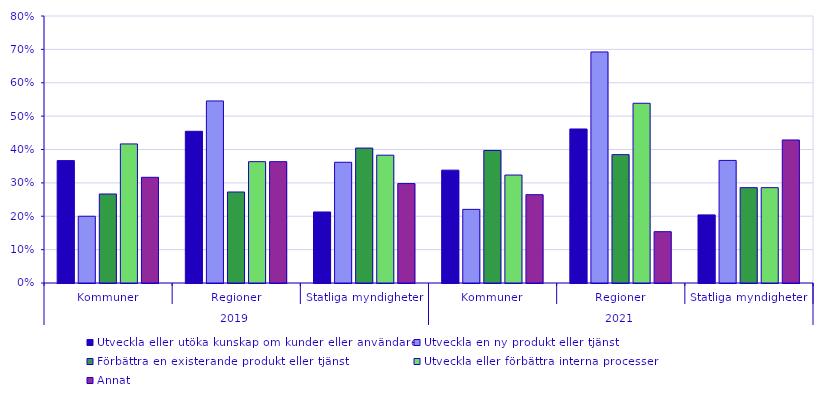
| Category | Utveckla eller utöka kunskap om kunder eller användare  | Utveckla en ny produkt eller tjänst | Förbättra en existerande produkt eller tjänst | Utveckla eller förbättra interna processer | Annat |
|---|---|---|---|---|---|
| 0 | 0.367 | 0.2 | 0.267 | 0.417 | 0.317 |
| 1 | 0.454 | 0.546 | 0.273 | 0.364 | 0.364 |
| 2 | 0.213 | 0.362 | 0.404 | 0.383 | 0.298 |
| 3 | 0.338 | 0.221 | 0.397 | 0.324 | 0.265 |
| 4 | 0.462 | 0.692 | 0.385 | 0.538 | 0.154 |
| 5 | 0.204 | 0.367 | 0.286 | 0.286 | 0.429 |